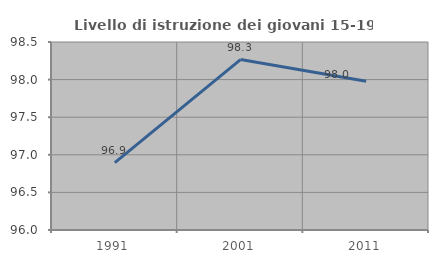
| Category | Livello di istruzione dei giovani 15-19 anni |
|---|---|
| 1991.0 | 96.896 |
| 2001.0 | 98.267 |
| 2011.0 | 97.979 |